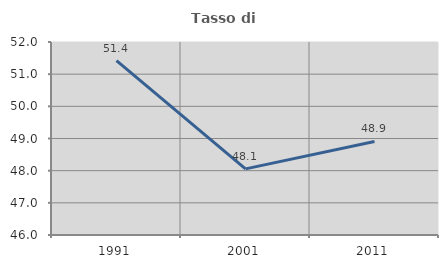
| Category | Tasso di occupazione   |
|---|---|
| 1991.0 | 51.422 |
| 2001.0 | 48.056 |
| 2011.0 | 48.908 |